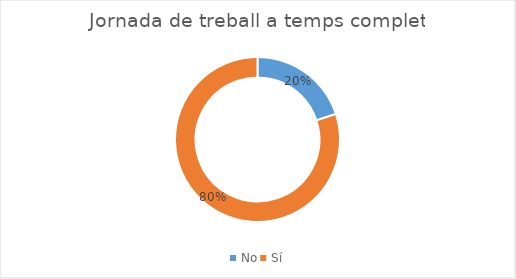
| Category | Series 0 |
|---|---|
| No | 38 |
| Sí | 152 |